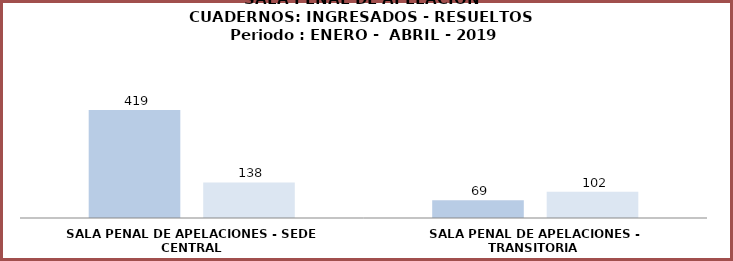
| Category | Series 0 | Series 1 |
|---|---|---|
| SALA PENAL DE APELACIONES - SEDE CENTRAL | 419 | 138 |
| SALA PENAL DE APELACIONES - TRANSITORIA  | 69 | 102 |